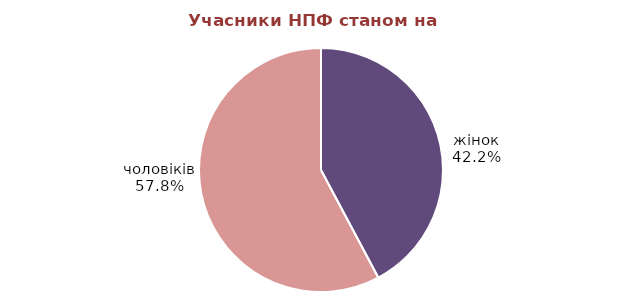
| Category | Series 0 |
|---|---|
| жінок | 369611 |
| чоловіків | 505990 |